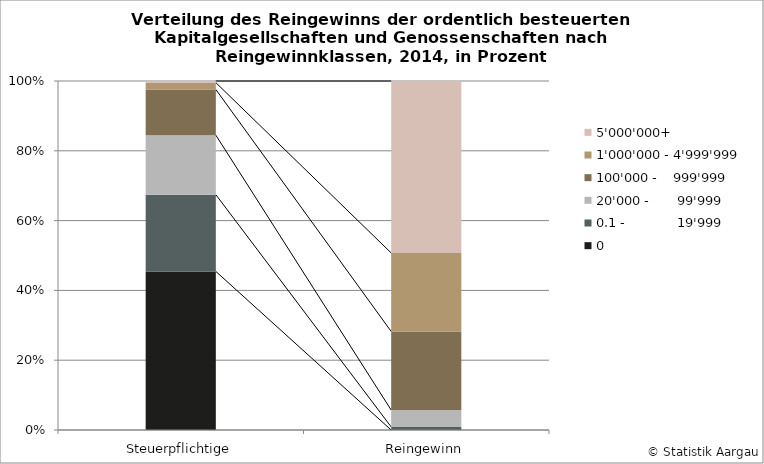
| Category | 0 | 0.1 -             19'999 | 20'000 -       99'999 | 100'000 -    999'999 | 1'000'000 - 4'999'999 | 5'000'000+ |
|---|---|---|---|---|---|---|
| Steuerpflichtige | 45.439 | 22.001 | 17.044 | 13.085 | 1.968 | 0.463 |
| Reingewinn | 0 | 0.881 | 4.84 | 22.508 | 22.507 | 49.264 |